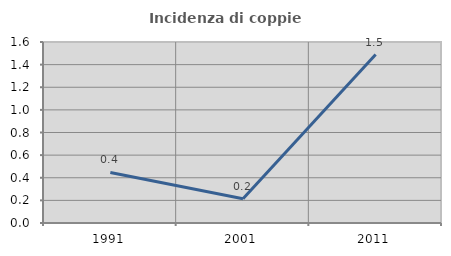
| Category | Incidenza di coppie miste |
|---|---|
| 1991.0 | 0.446 |
| 2001.0 | 0.214 |
| 2011.0 | 1.489 |